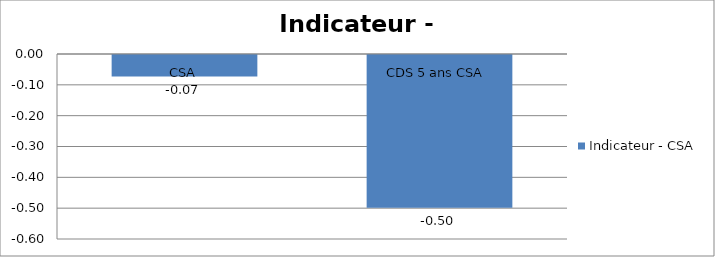
| Category | Indicateur - CSA |
|---|---|
| CSA | -0.07 |
| CDS 5 ans CSA  | -0.495 |